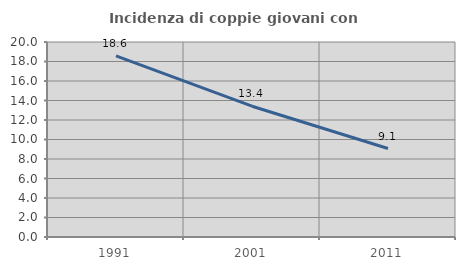
| Category | Incidenza di coppie giovani con figli |
|---|---|
| 1991.0 | 18.583 |
| 2001.0 | 13.415 |
| 2011.0 | 9.072 |